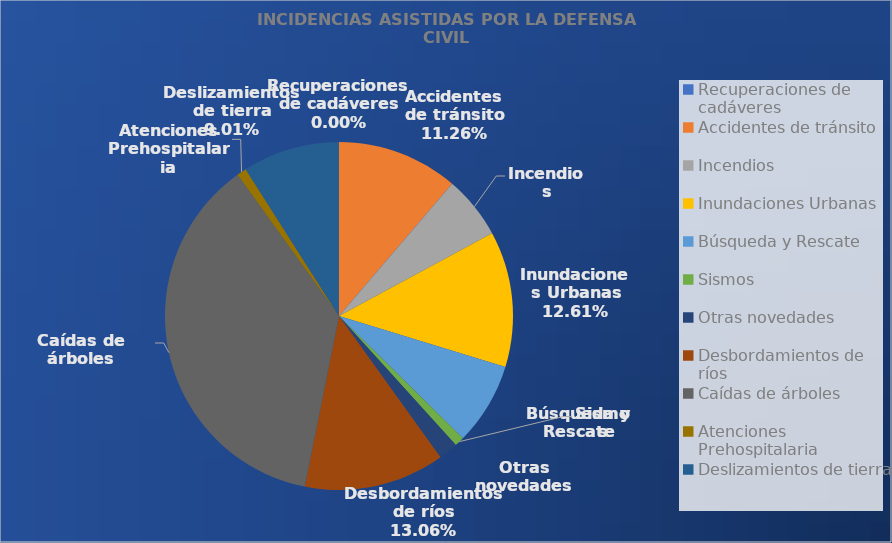
| Category | Series 0 |
|---|---|
| Recuperaciones de cadáveres | 0 |
| Accidentes de tránsito | 25 |
| Incendios | 13 |
| Inundaciones Urbanas | 28 |
| Búsqueda y Rescate | 17 |
| Sismos | 2 |
| Otras novedades | 4 |
| Desbordamientos de ríos | 29 |
| Caídas de árboles | 82 |
| Atenciones Prehospitalaria | 2 |
| Deslizamientos de tierra | 20 |